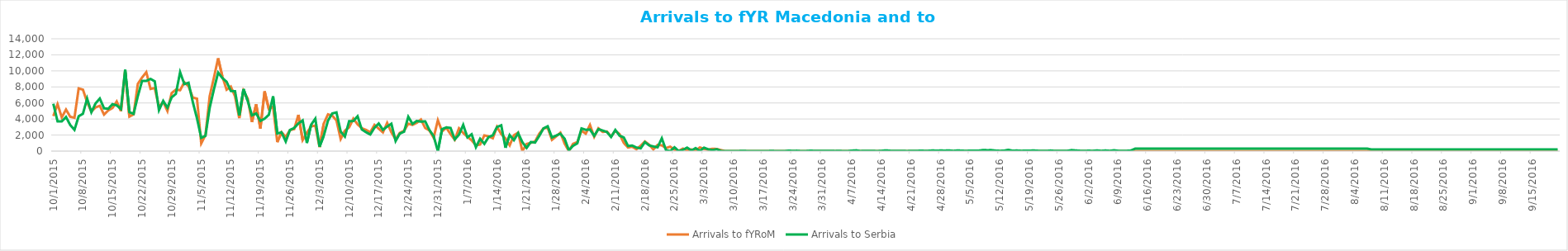
| Category | Arrivals to fYRoM | Arrivals to Serbia |
|---|---|---|
| 10/1/15 | 4370 | 5900 |
| 10/2/15 | 5853 | 3700 |
| 10/3/15 | 4202 | 3700 |
| 10/4/15 | 5181 | 4250 |
| 10/5/15 | 4282 | 3250 |
| 10/6/15 | 4156 | 2650 |
| 10/7/15 | 7816 | 4350 |
| 10/8/15 | 7663 | 4650 |
| 10/9/15 | 6107 | 6550 |
| 10/10/15 | 4922 | 4850 |
| 10/11/15 | 5448 | 5950 |
| 10/12/15 | 5645 | 6556 |
| 10/13/15 | 4551 | 5330 |
| 10/14/15 | 5073 | 5280 |
| 10/15/15 | 5373 | 5850 |
| 10/16/15 | 6181 | 5700 |
| 10/17/15 | 4988 | 5250 |
| 10/18/15 | 10005 | 10150 |
| 10/19/15 | 4299 | 4850 |
| 10/20/15 | 4584 | 4650 |
| 10/21/15 | 8384 | 6850 |
| 10/22/15 | 9174 | 8750 |
| 10/23/15 | 9840 | 8750 |
| 10/24/15 | 7752 | 9000 |
| 10/25/15 | 7864 | 8700 |
| 10/26/15 | 5500 | 5100 |
| 10/27/15 | 6146 | 6257 |
| 10/28/15 | 5000 | 5415 |
| 10/29/15 | 7231 | 6700 |
| 10/30/15 | 7663 | 7138 |
| 10/31/15 | 7590 | 9834 |
| 11/1/15 | 8584 | 8354 |
| 11/2/15 | 8075 | 8521 |
| 11/3/15 | 6682 | 6129 |
| 11/4/15 | 6532 | 4073 |
| 11/5/15 | 960 | 1652 |
| 11/6/15 | 1987 | 1906 |
| 11/7/15 | 6847 | 5397 |
| 11/8/15 | 9148 | 7695 |
| 11/9/15 | 11572 | 9785 |
| 11/10/15 | 9305 | 9107 |
| 11/11/15 | 7651 | 8648 |
| 11/12/15 | 8038 | 7500 |
| 11/13/15 | 6826 | 7464 |
| 11/14/15 | 4107 | 4453 |
| 11/15/15 | 7511 | 7734 |
| 11/16/15 | 6557 | 6267 |
| 11/17/15 | 3621 | 4460 |
| 11/18/15 | 5831 | 4694 |
| 11/19/15 | 2816 | 3765 |
| 11/20/15 | 7453 | 4042 |
| 11/21/15 | 5255 | 4527 |
| 11/22/15 | 5539 | 6826 |
| 11/23/15 | 1113 | 2201 |
| 11/24/15 | 2347 | 2335 |
| 11/25/15 | 1779 | 1194 |
| 11/26/15 | 2617 | 2636 |
| 11/27/15 | 2744 | 2878 |
| 11/28/15 | 4520 | 3454 |
| 11/29/15 | 1373 | 3825 |
| 11/30/15 | 2270 | 1009 |
| 12/1/15 | 3094 | 3284 |
| 12/2/15 | 3174 | 4040 |
| 12/3/15 | 494 | 553 |
| 12/4/15 | 3436 | 1927 |
| 12/5/15 | 4580 | 3799 |
| 12/6/15 | 4425 | 4686 |
| 12/7/15 | 3826 | 4823 |
| 12/8/15 | 1508 | 2437 |
| 12/9/15 | 2550 | 1807 |
| 12/10/15 | 2956 | 3723 |
| 12/11/15 | 4047 | 3747 |
| 12/12/15 | 3338 | 4339 |
| 12/13/15 | 2849 | 2698 |
| 12/14/15 | 2644 | 2353 |
| 12/15/15 | 2349 | 2067 |
| 12/16/15 | 3264 | 2916 |
| 12/17/15 | 2801 | 3438 |
| 12/18/15 | 2332 | 2649 |
| 12/19/15 | 3515 | 3052 |
| 12/20/15 | 2338 | 3405 |
| 12/21/15 | 1470 | 1253 |
| 12/22/15 | 2272 | 2186 |
| 12/23/15 | 2529 | 2415 |
| 12/24/15 | 3415 | 4279 |
| 12/25/15 | 3268 | 3390 |
| 12/26/15 | 3521 | 3757 |
| 12/27/15 | 3938 | 3674 |
| 12/28/15 | 2884 | 3708 |
| 12/29/15 | 2577 | 2629 |
| 12/30/15 | 1665 | 1879 |
| 12/31/15 | 3848 | 0 |
| 1/1/16 | 2454 | 2745 |
| 1/2/16 | 2918 | 2947 |
| 1/3/16 | 2112 | 2889 |
| 1/4/16 | 1415 | 1462 |
| 1/5/16 | 2842 | 2041 |
| 1/6/16 | 2258 | 3273 |
| 1/7/16 | 1776 | 1715 |
| 1/8/16 | 1344 | 2100 |
| 1/9/16 | 715 | 489 |
| 1/10/16 | 819 | 1538 |
| 1/11/16 | 1959 | 905 |
| 1/12/16 | 1840 | 1743 |
| 1/13/16 | 1600 | 1973 |
| 1/14/16 | 3022 | 3006 |
| 1/15/16 | 2119 | 3213 |
| 1/16/16 | 1598 | 415 |
| 1/17/16 | 720 | 1995 |
| 1/18/16 | 1980 | 1362 |
| 1/19/16 | 2298 | 2244 |
| 1/20/16 | 0 | 1113 |
| 1/21/16 | 892 | 397 |
| 1/22/16 | 1030 | 1134 |
| 1/23/16 | 1208 | 1064 |
| 1/24/16 | 2174 | 1895 |
| 1/25/16 | 2836 | 2827 |
| 1/26/16 | 2908 | 3091 |
| 1/27/16 | 1402 | 1695 |
| 1/28/16 | 1837 | 1940 |
| 1/29/16 | 2292 | 2167 |
| 1/30/16 | 931 | 1540 |
| 1/31/16 | 0 | 103 |
| 2/1/16 | 908 | 660 |
| 2/2/16 | 1121 | 966 |
| 2/3/16 | 2558 | 2825 |
| 2/4/16 | 2173 | 2653 |
| 2/5/16 | 3259 | 2694 |
| 2/6/16 | 1780 | 1901 |
| 2/7/16 | 2838 | 2739 |
| 2/8/16 | 2392 | 2563 |
| 2/9/16 | 2441 | 2379 |
| 2/10/16 | 1817 | 1758 |
| 2/11/16 | 2540 | 2636 |
| 2/12/16 | 2115 | 1923 |
| 2/13/16 | 1019 | 1699 |
| 2/14/16 | 452 | 641 |
| 2/15/16 | 542 | 691 |
| 2/16/16 | 234 | 443 |
| 2/17/16 | 668 | 345 |
| 2/18/16 | 1200 | 1117 |
| 2/19/16 | 799 | 713 |
| 2/20/16 | 209 | 580 |
| 2/21/16 | 774 | 476 |
| 2/22/16 | 714 | 1595 |
| 2/23/16 | 382 | 106 |
| 2/24/16 | 551 | 1 |
| 2/25/16 | 168 | 475 |
| 2/26/16 | 20 | 0 |
| 2/27/16 | 310 | 158 |
| 2/28/16 | 92 | 431 |
| 2/29/16 | 208 | 69 |
| 3/1/16 | 30 | 372 |
| 3/2/16 | 457 | 16 |
| 3/3/16 | 269 | 428 |
| 3/4/16 | 177 | 218 |
| 3/5/16 | 293 | 115 |
| 3/6/16 | 261 | 236 |
| 3/7/16 | 127 | 14 |
| 3/8/16 | 0 | 0 |
| 3/9/16 | 0 | 3 |
| 3/10/16 | 0 | 0 |
| 3/11/16 | 0 | 0 |
| 3/12/16 | 0 | 35 |
| 3/13/16 | 0 | 12 |
| 3/14/16 | 0 | 0 |
| 3/15/16 | 0 | 0 |
| 3/16/16 | 0 | 0 |
| 3/17/16 | 0 | 0 |
| 3/18/16 | 0 | 0 |
| 3/19/16 | 0 | 30 |
| 3/20/16 | 0 | 0 |
| 3/21/16 | 0 | 0 |
| 3/22/16 | 0 | 0 |
| 3/23/16 | 0 | 49 |
| 3/24/16 | 0 | 31 |
| 3/25/16 | 0 | 40 |
| 3/26/16 | 0 | 0 |
| 3/27/16 | 0 | 4 |
| 3/28/16 | 0 | 42 |
| 3/29/16 | 0 | 37 |
| 3/30/16 | 0 | 21 |
| 3/31/16 | 0 | 14 |
| 4/1/16 | 0 | 28 |
| 4/2/16 | 0 | 32 |
| 4/3/16 | 0 | 10 |
| 4/4/16 | 0 | 28 |
| 4/5/16 | 0 | 0 |
| 4/6/16 | 0 | 4 |
| 4/7/16 | 0 | 58 |
| 4/8/16 | 0 | 93 |
| 4/9/16 | 0 | 8 |
| 4/10/16 | 0 | 30 |
| 4/11/16 | 0 | 34 |
| 4/12/16 | 0 | 22 |
| 4/13/16 | 0 | 3 |
| 4/14/16 | 0 | 34 |
| 4/15/16 | 0 | 90 |
| 4/16/16 | 0 | 41 |
| 4/17/16 | 0 | 15 |
| 4/18/16 | 0 | 17 |
| 4/19/16 | 0 | 34 |
| 4/20/16 | 0 | 5 |
| 4/21/16 | 0 | 31 |
| 4/22/16 | 0 | 19 |
| 4/23/16 | 0 | 45 |
| 4/24/16 | 0 | 38 |
| 4/25/16 | 0 | 34 |
| 4/26/16 | 0 | 73 |
| 4/27/16 | 0 | 54 |
| 4/28/16 | 0 | 69 |
| 4/29/16 | 0 | 59 |
| 4/30/16 | 0 | 80 |
| 5/1/16 | 0 | 26 |
| 5/2/16 | 0 | 81 |
| 5/3/16 | 0 | 50 |
| 5/4/16 | 0 | 25 |
| 5/5/16 | 0 | 58 |
| 5/6/16 | 0 | 49 |
| 5/7/16 | 0 | 59 |
| 5/8/16 | 0 | 128 |
| 5/9/16 | 0 | 113 |
| 5/10/16 | 0 | 119 |
| 5/11/16 | 0 | 62 |
| 5/12/16 | 0 | 33 |
| 5/13/16 | 0 | 51 |
| 5/14/16 | 0 | 161 |
| 5/15/16 | 0 | 45 |
| 5/16/16 | 0 | 71 |
| 5/17/16 | 0 | 35 |
| 5/18/16 | 0 | 44 |
| 5/19/16 | 0 | 55 |
| 5/20/16 | 0 | 74 |
| 5/21/16 | 0 | 39 |
| 5/22/16 | 0 | 16 |
| 5/23/16 | 0 | 15 |
| 5/24/16 | 0 | 68 |
| 5/25/16 | 0 | 23 |
| 5/26/16 | 0 | 15 |
| 5/27/16 | 0 | 20 |
| 5/28/16 | 0 | 35 |
| 5/29/16 | 0 | 121 |
| 5/30/16 | 0 | 75 |
| 5/31/16 | 0 | 37 |
| 6/1/16 | 0 | 29 |
| 6/2/16 | 0 | 43 |
| 6/3/16 | 0 | 32 |
| 6/4/16 | 0 | 80 |
| 6/5/16 | 0 | 26 |
| 6/6/16 | 0 | 74 |
| 6/7/16 | 0 | 28 |
| 6/8/16 | 0 | 101 |
| 6/9/16 | 0 | 38 |
| 6/10/16 | 0 | 27 |
| 6/11/16 | 0 | 32 |
| 6/12/16 | 0 | 71 |
| 6/13/16 | 0 | 300 |
| 6/14/16 | 0 | 300 |
| 6/15/16 | 0 | 300 |
| 6/16/16 | 0 | 300 |
| 6/17/16 | 0 | 300 |
| 6/18/16 | 0 | 300 |
| 6/19/16 | 0 | 300 |
| 6/20/16 | 0 | 300 |
| 6/21/16 | 0 | 300 |
| 6/22/16 | 0 | 300 |
| 6/23/16 | 0 | 300 |
| 6/24/16 | 0 | 300 |
| 6/25/16 | 0 | 300 |
| 6/26/16 | 0 | 300 |
| 6/27/16 | 0 | 300 |
| 6/28/16 | 0 | 300 |
| 6/29/16 | 0 | 300 |
| 6/30/16 | 0 | 300 |
| 7/1/16 | 0 | 300 |
| 7/2/16 | 0 | 300 |
| 7/3/16 | 0 | 300 |
| 7/4/16 | 0 | 300 |
| 7/5/16 | 0 | 300 |
| 7/6/16 | 0 | 300 |
| 7/7/16 | 0 | 300 |
| 7/8/16 | 0 | 300 |
| 7/9/16 | 0 | 300 |
| 7/10/16 | 0 | 300 |
| 7/11/16 | 0 | 300 |
| 7/12/16 | 0 | 300 |
| 7/13/16 | 0 | 300 |
| 7/14/16 | 0 | 300 |
| 7/15/16 | 0 | 300 |
| 7/16/16 | 0 | 300 |
| 7/17/16 | 0 | 300 |
| 7/18/16 | 0 | 300 |
| 7/19/16 | 0 | 300 |
| 7/20/16 | 0 | 300 |
| 7/21/16 | 0 | 300 |
| 7/22/16 | 0 | 300 |
| 7/23/16 | 0 | 300 |
| 7/24/16 | 0 | 300 |
| 7/25/16 | 0 | 300 |
| 7/26/16 | 0 | 300 |
| 7/27/16 | 0 | 300 |
| 7/28/16 | 0 | 300 |
| 7/29/16 | 0 | 300 |
| 7/30/16 | 0 | 300 |
| 7/31/16 | 0 | 300 |
| 8/1/16 | 0 | 300 |
| 8/2/16 | 0 | 300 |
| 8/3/16 | 0 | 300 |
| 8/4/16 | 0 | 300 |
| 8/5/16 | 0 | 300 |
| 8/6/16 | 0 | 300 |
| 8/7/16 | 0 | 300 |
| 8/8/16 | 0 | 200 |
| 8/9/16 | 0 | 200 |
| 8/10/16 | 0 | 200 |
| 8/11/16 | 0 | 200 |
| 8/12/16 | 0 | 200 |
| 8/13/16 | 0 | 200 |
| 8/14/16 | 0 | 200 |
| 8/15/16 | 0 | 200 |
| 8/16/16 | 0 | 200 |
| 8/17/16 | 0 | 200 |
| 8/18/16 | 0 | 200 |
| 8/19/16 | 0 | 200 |
| 8/20/16 | 0 | 200 |
| 8/21/16 | 0 | 200 |
| 8/22/16 | 0 | 200 |
| 8/23/16 | 0 | 200 |
| 8/24/16 | 0 | 200 |
| 8/25/16 | 0 | 200 |
| 8/26/16 | 0 | 200 |
| 8/27/16 | 0 | 200 |
| 8/28/16 | 0 | 200 |
| 8/29/16 | 0 | 200 |
| 8/30/16 | 0 | 200 |
| 8/31/16 | 0 | 200 |
| 9/1/16 | 0 | 200 |
| 9/2/16 | 0 | 200 |
| 9/3/16 | 0 | 200 |
| 9/4/16 | 0 | 200 |
| 9/5/16 | 0 | 200 |
| 9/6/16 | 0 | 200 |
| 9/7/16 | 0 | 200 |
| 9/8/16 | 0 | 200 |
| 9/9/16 | 0 | 200 |
| 9/10/16 | 0 | 200 |
| 9/11/16 | 0 | 200 |
| 9/12/16 | 0 | 200 |
| 9/13/16 | 0 | 200 |
| 9/14/16 | 0 | 200 |
| 9/15/16 | 0 | 200 |
| 9/16/16 | 0 | 200 |
| 9/17/16 | 0 | 200 |
| 9/18/16 | 0 | 200 |
| 9/19/16 | 0 | 200 |
| 9/20/16 | 0 | 200 |
| 9/21/16 | 0 | 200 |